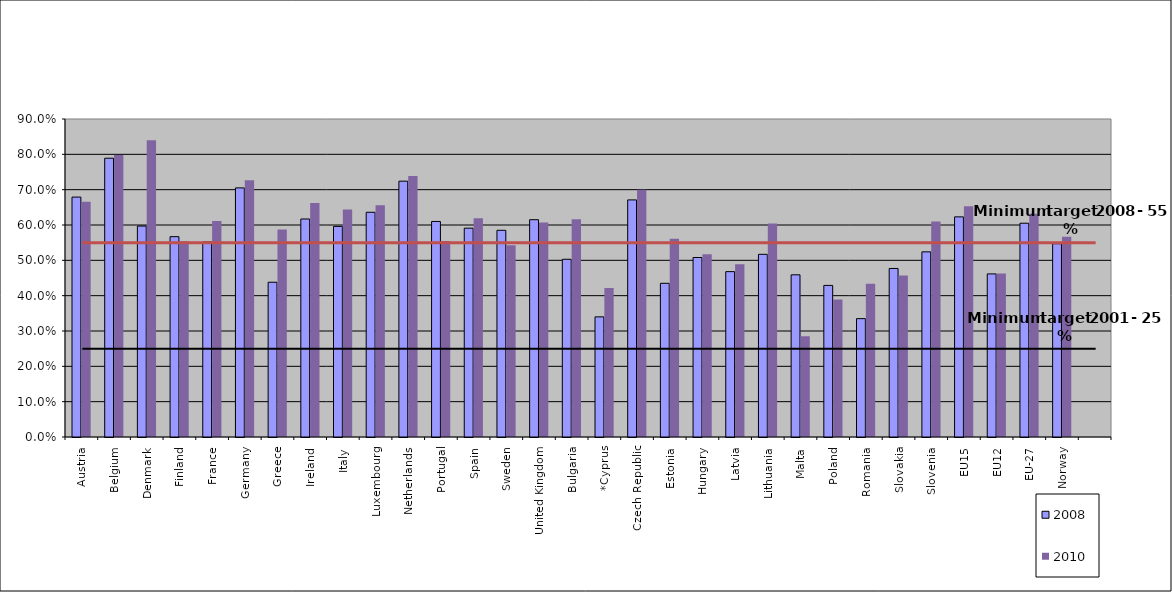
| Category | 2008 | 2010 |
|---|---|---|
| Austria | 0.679 | 0.666 |
| Belgium | 0.789 | 0.798 |
| Denmark | 0.597 | 0.84 |
| Finland | 0.567 | 0.554 |
| France | 0.552 | 0.611 |
| Germany | 0.705 | 0.727 |
| Greece | 0.438 | 0.587 |
| Ireland | 0.617 | 0.662 |
| Italy | 0.596 | 0.644 |
| Luxembourg | 0.636 | 0.656 |
| Netherlands | 0.724 | 0.739 |
| Portugal | 0.61 | 0.555 |
| Spain | 0.591 | 0.619 |
| Sweden | 0.585 | 0.543 |
| United Kingdom | 0.615 | 0.607 |
| Bulgaria | 0.503 | 0.616 |
| *Cyprus | 0.34 | 0.422 |
| Czech Republic | 0.671 | 0.7 |
| Estonia | 0.435 | 0.561 |
| Hungary | 0.508 | 0.517 |
| Latvia | 0.468 | 0.489 |
| Lithuania | 0.517 | 0.604 |
| Malta | 0.459 | 0.285 |
| Poland | 0.429 | 0.389 |
| Romania | 0.335 | 0.434 |
| Slovakia | 0.477 | 0.457 |
| Slovenia | 0.524 | 0.61 |
| EU15 | 0.623 | 0.653 |
| EU12 | 0.462 | 0.463 |
| EU-27 | 0.605 | 0.632 |
| Norway | 0.547 | 0.567 |